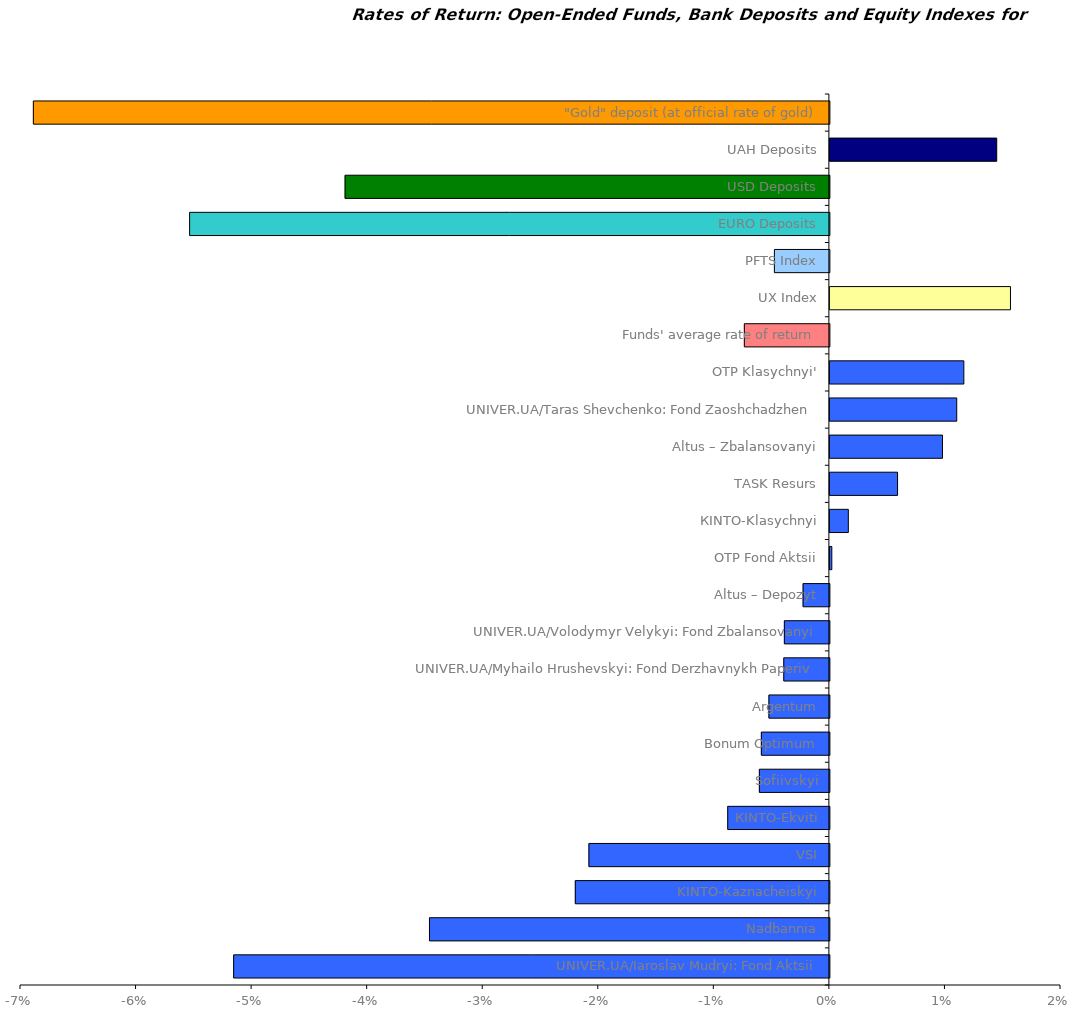
| Category | Series 0 |
|---|---|
| UNIVER.UA/Iaroslav Mudryi: Fond Aktsii | -0.052 |
| Nadbannia | -0.035 |
| KINTO-Kaznacheiskyi | -0.022 |
| VSI | -0.021 |
| КІNTO-Ekviti | -0.009 |
| Sofiivskyi | -0.006 |
| Bonum Optimum | -0.006 |
| Argentum | -0.005 |
| UNIVER.UA/Myhailo Hrushevskyi: Fond Derzhavnykh Paperiv | -0.004 |
| UNIVER.UA/Volodymyr Velykyi: Fond Zbalansovanyi | -0.004 |
| Altus – Depozyt | -0.002 |
| OTP Fond Aktsii | 0 |
| КІNТО-Klasychnyi | 0.002 |
| ТАSK Resurs | 0.006 |
| Altus – Zbalansovanyi | 0.01 |
| UNIVER.UA/Taras Shevchenko: Fond Zaoshchadzhen | 0.011 |
| OTP Klasychnyi' | 0.012 |
| Funds' average rate of return | -0.007 |
| UX Index | 0.016 |
| PFTS Index | -0.005 |
| EURO Deposits | -0.055 |
| USD Deposits | -0.042 |
| UAH Deposits | 0.014 |
| "Gold" deposit (at official rate of gold) | -0.069 |